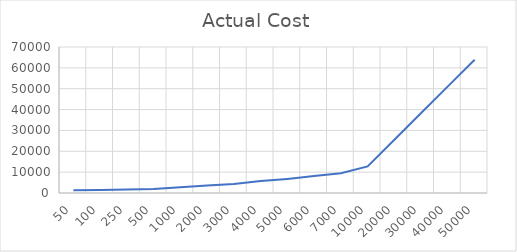
| Category | Actual Cost |
|---|---|
| 50.0 | 1260.714 |
| 100.0 | 1453.489 |
| 250.0 | 1646.264 |
| 500.0 | 1950.427 |
| 1000.0 | 2741.216 |
| 2000.0 | 3646.156 |
| 3000.0 | 4312.758 |
| 4000.0 | 5711.907 |
| 5000.0 | 6767.674 |
| 6000.0 | 8098.147 |
| 7000.0 | 9428.619 |
| 10000.0 | 12777.726 |
| 20000.0 | 25555.452 |
| 30000.0 | 38333.178 |
| 40000.0 | 51110.904 |
| 50000.0 | 63888.63 |